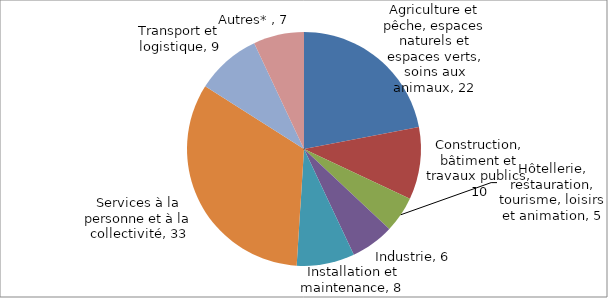
| Category | Series 0 |
|---|---|
| Agriculture et pêche, espaces naturels et espaces verts, soins aux animaux | 22 |
| Construction, bâtiment et travaux publics | 10 |
| Hôtellerie, restauration, tourisme, loisirs et animation | 5 |
| Industrie | 6 |
| Installation et maintenance | 8 |
| Services à la personne et à la collectivité | 33 |
| Transport et logistique | 9 |
| Autres*  | 7 |